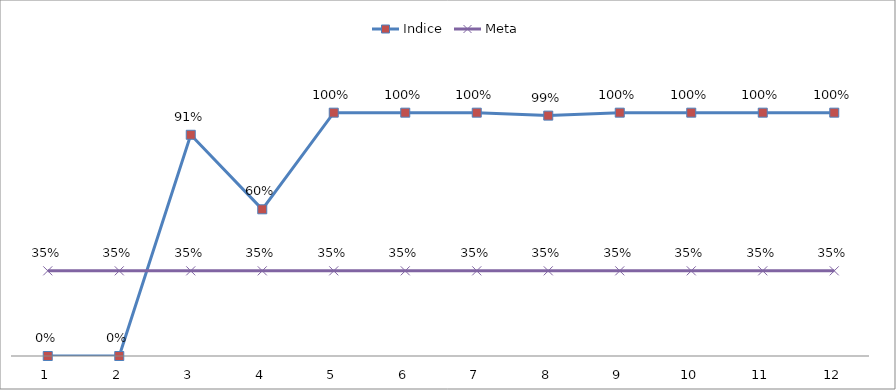
| Category | Indice | Meta |
|---|---|---|
| 0 | 0 | 0.35 |
| 1 | 0 | 0.35 |
| 2 | 0.909 | 0.35 |
| 3 | 0.603 | 0.35 |
| 4 | 1 | 0.35 |
| 5 | 1 | 0.35 |
| 6 | 1 | 0.35 |
| 7 | 0.988 | 0.35 |
| 8 | 1 | 0.35 |
| 9 | 1 | 0.35 |
| 10 | 1 | 0.35 |
| 11 | 1 | 0.35 |